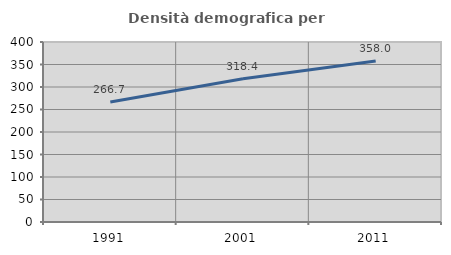
| Category | Densità demografica |
|---|---|
| 1991.0 | 266.686 |
| 2001.0 | 318.44 |
| 2011.0 | 357.973 |